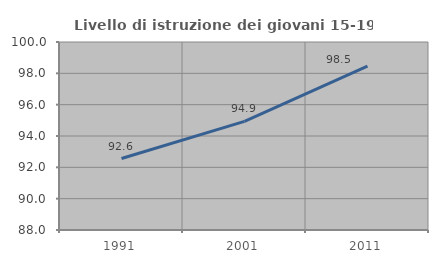
| Category | Livello di istruzione dei giovani 15-19 anni |
|---|---|
| 1991.0 | 92.562 |
| 2001.0 | 94.937 |
| 2011.0 | 98.462 |